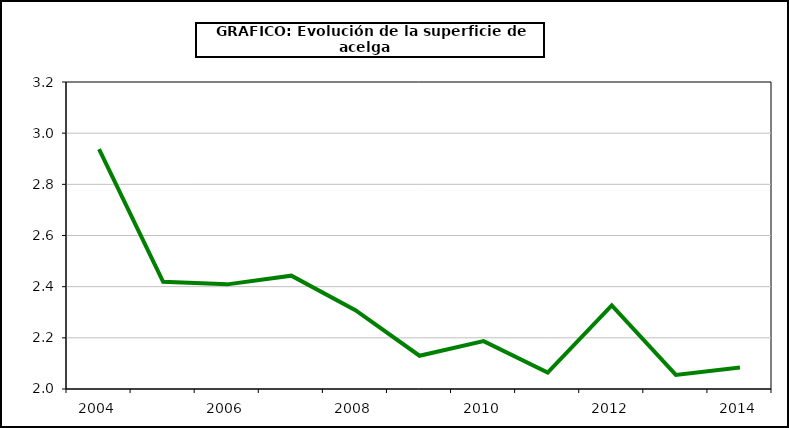
| Category | superficie |
|---|---|
| 2004.0 | 2.938 |
| 2005.0 | 2.419 |
| 2006.0 | 2.409 |
| 2007.0 | 2.443 |
| 2008.0 | 2.308 |
| 2009.0 | 2.13 |
| 2010.0 | 2.187 |
| 2011.0 | 2.064 |
| 2012.0 | 2.327 |
| 2013.0 | 2.055 |
| 2014.0 | 2.084 |